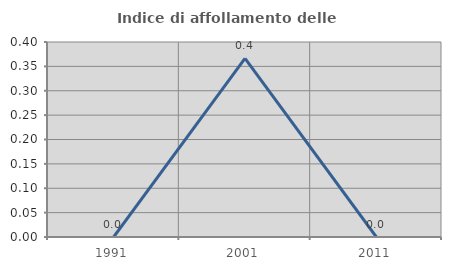
| Category | Indice di affollamento delle abitazioni  |
|---|---|
| 1991.0 | 0 |
| 2001.0 | 0.366 |
| 2011.0 | 0 |